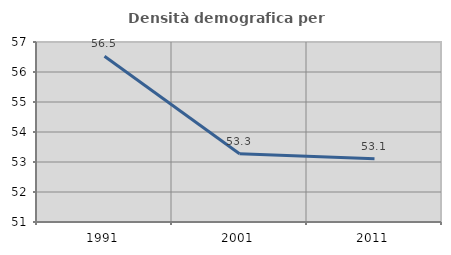
| Category | Densità demografica |
|---|---|
| 1991.0 | 56.523 |
| 2001.0 | 53.275 |
| 2011.0 | 53.107 |